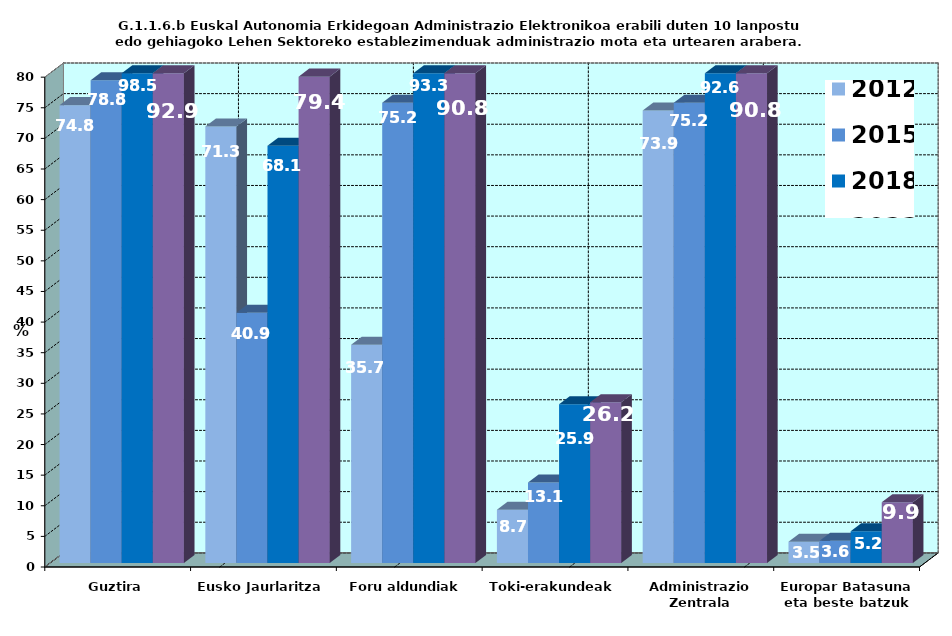
| Category | 2012 | 2015 | 2018 | 2022 |
|---|---|---|---|---|
| Guztira | 74.783 | 78.832 | 98.519 | 92.908 |
| Eusko Jaurlaritza | 71.304 | 40.876 | 68.148 | 79.433 |
| Foru aldundiak | 35.652 | 75.182 | 93.333 | 90.78 |
| Toki-erakundeak | 8.696 | 13.139 | 25.926 | 26.241 |
| Administrazio Zentrala | 73.913 | 75.182 | 92.593 | 90.78 |
| Europar Batasuna eta beste batzuk | 3.478 | 3.65 | 5.185 | 9.929 |